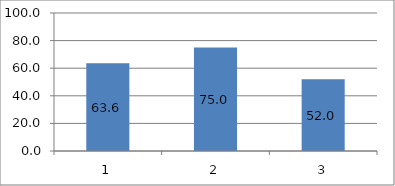
| Category | Series 0 |
|---|---|
| 0 | 63.636 |
| 1 | 75 |
| 2 | 52 |